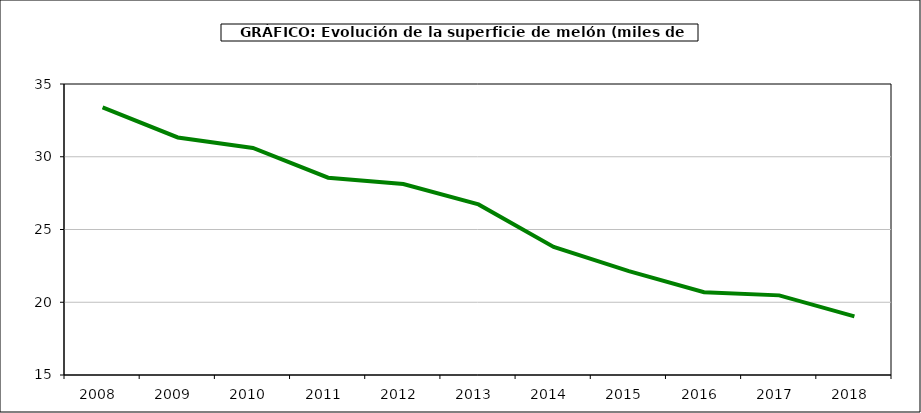
| Category | superficie |
|---|---|
| 2008.0 | 33.388 |
| 2009.0 | 31.327 |
| 2010.0 | 30.601 |
| 2011.0 | 28.561 |
| 2012.0 | 28.13 |
| 2013.0 | 26.723 |
| 2014.0 | 23.8 |
| 2015.0 | 22.144 |
| 2016.0 | 20.686 |
| 2017.0 | 20.473 |
| 2018.0 | 19.025 |